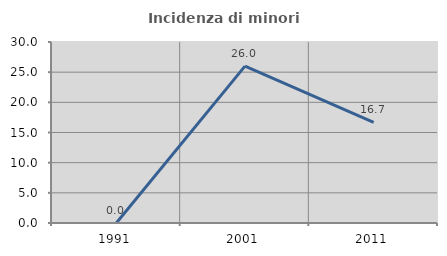
| Category | Incidenza di minori stranieri |
|---|---|
| 1991.0 | 0 |
| 2001.0 | 26 |
| 2011.0 | 16.667 |